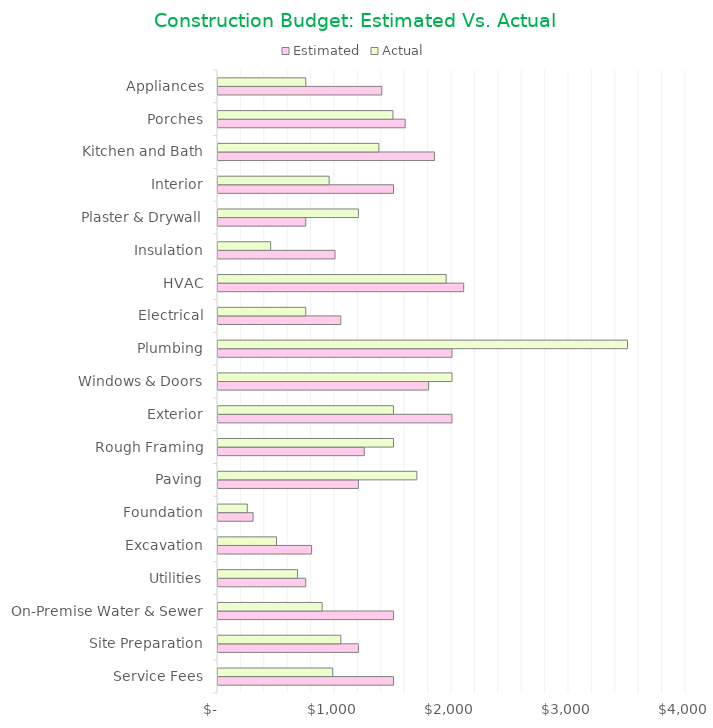
| Category | Estimated | Actual |
|---|---|---|
| Service Fees | 1500 | 980 |
| Site Preparation | 1200 | 1050 |
| On-Premise Water & Sewer | 1500 | 890 |
| Utilities | 750 | 680 |
| Excavation | 800 | 500 |
| Foundation | 300 | 250 |
| Paving | 1200 | 1700 |
| Rough Framing | 1250 | 1500 |
| Exterior | 2000 | 1500 |
| Windows & Doors | 1800 | 2000 |
| Plumbing | 2000 | 3500 |
| Electrical | 1050 | 750 |
| HVAC | 2100 | 1950 |
| Insulation | 1000 | 450 |
| Plaster & Drywall | 750 | 1200 |
| Interior | 1500 | 950 |
| Kitchen and Bath | 1850 | 1375 |
| Porches | 1600 | 1495 |
| Appliances | 1400 | 750 |